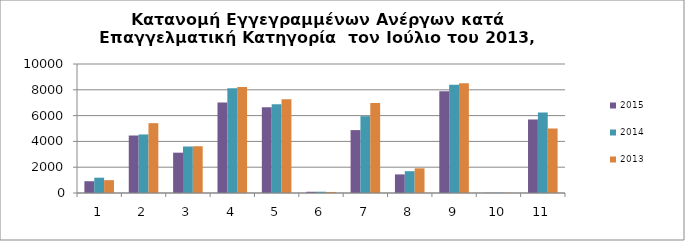
| Category | 2015 | 2014 | 2013 |
|---|---|---|---|
| 1.0 | 912 | 1186 | 995 |
| 2.0 | 4457 | 4539 | 5413 |
| 3.0 | 3126 | 3604 | 3625 |
| 4.0 | 7019 | 8120 | 8216 |
| 5.0 | 6654 | 6886 | 7259 |
| 6.0 | 96 | 99 | 81 |
| 7.0 | 4875 | 5955 | 6980 |
| 8.0 | 1442 | 1692 | 1914 |
| 9.0 | 7881 | 8384 | 8501 |
| 10.0 | 15 | 22 | 15 |
| 11.0 | 5699 | 6240 | 5002 |